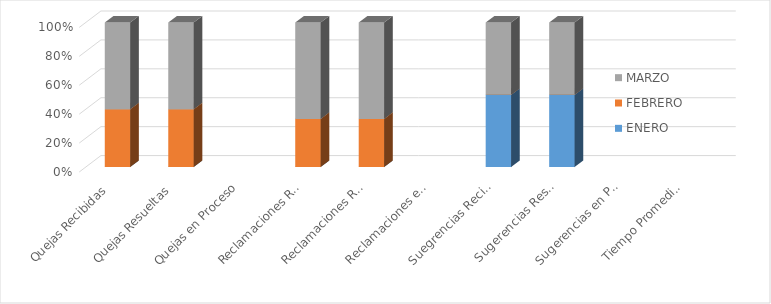
| Category | ENERO | FEBRERO | MARZO |
|---|---|---|---|
| Quejas Recibidas | 0 | 2 | 3 |
| Quejas Resueltas | 0 | 2 | 3 |
| Quejas en Proceso | 0 | 0 | 0 |
| Reclamaciones Recibidas | 0 | 1 | 2 |
| Reclamaciones Resueltas | 0 | 1 | 2 |
| Reclamaciones en Proceso | 0 | 0 | 0 |
| Suegrencias Recibidas | 1 | 0 | 1 |
| Sugerencias Resueltas | 1 | 0 | 1 |
| Sugerencias en Proceso | 0 | 0 | 0 |
| Tiempo Promedio en que fueron Respondidas | 0 | 0 | 0 |